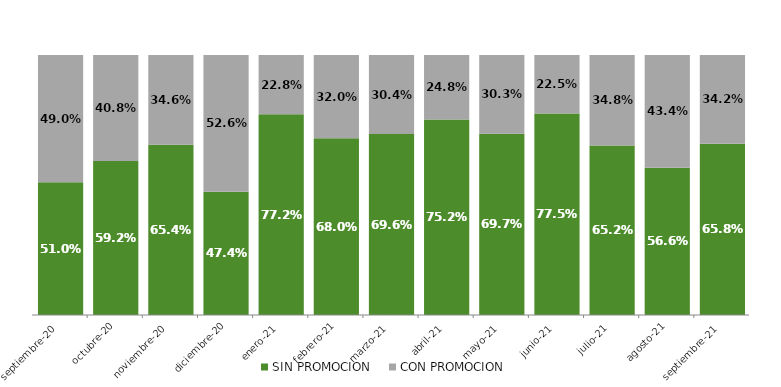
| Category | SIN PROMOCION   | CON PROMOCION   |
|---|---|---|
| 2020-09-01 | 0.51 | 0.49 |
| 2020-10-01 | 0.592 | 0.408 |
| 2020-11-01 | 0.654 | 0.346 |
| 2020-12-01 | 0.474 | 0.526 |
| 2021-01-01 | 0.772 | 0.228 |
| 2021-02-01 | 0.68 | 0.32 |
| 2021-03-01 | 0.696 | 0.304 |
| 2021-04-01 | 0.752 | 0.248 |
| 2021-05-01 | 0.697 | 0.303 |
| 2021-06-01 | 0.775 | 0.225 |
| 2021-07-01 | 0.652 | 0.348 |
| 2021-08-01 | 0.566 | 0.434 |
| 2021-09-01 | 0.658 | 0.342 |